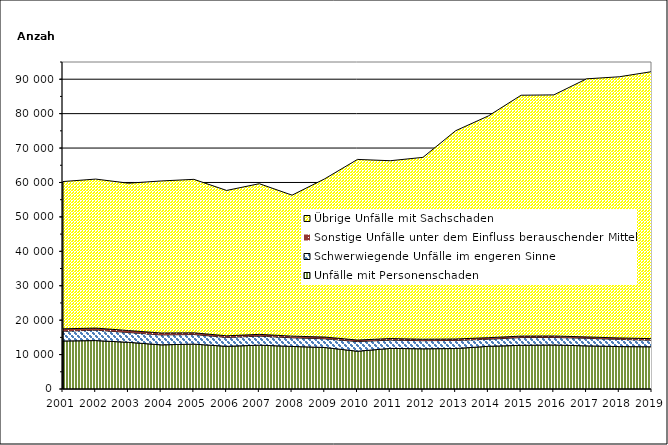
| Category | Unfälle mit Personenschaden | Schwerwiegende Unfälle im engeren Sinne | Sonstige Unfälle unter dem Einfluss berauschender Mittel 1) | Übrige Unfälle mit Sachschaden |
|---|---|---|---|---|
| 2001.0 | 13950 | 2845 | 688 | 42788 |
| 2002.0 | 14072 | 3028 | 595 | 43289 |
| 2003.0 | 13561 | 2866 | 559 | 42806 |
| 2004.0 | 12827 | 2877 | 564 | 44173 |
| 2005.0 | 13033 | 2795 | 499 | 44581 |
| 2006.0 | 12400 | 2588 | 466 | 42228 |
| 2007.0 | 12740 | 2628 | 507 | 43770 |
| 2008.0 | 12369 | 2510 | 481 | 40954 |
| 2009.0 | 12061 | 2528 | 502 | 45976 |
| 2010.0 | 10974 | 2803 | 441 | 52481 |
| 2011.0 | 11793 | 2419 | 443 | 51662 |
| 2012.0 | 11682 | 2353 | 422 | 52839 |
| 2013.0 | 11757 | 2357 | 414 | 60506 |
| 2014.0 | 12404 | 2056 | 448 | 64425 |
| 2015.0 | 12695 | 2249 | 427 | 69975 |
| 2016.0 | 12783 | 2187 | 433 | 70040 |
| 2017.0 | 12528 | 2214 | 385 | 74978 |
| 2018.0 | 12324 | 2084 | 421 | 75878 |
| 2019.0 | 12271 | 1914 | 438 | 77586 |